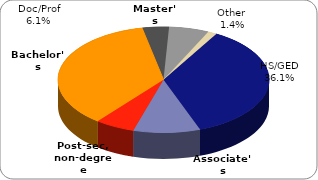
| Category | Series 0 |
|---|---|
| High school/
GED | 0.361 |
| Associate's | 0.102 |
| Post-sec,
non-degree | 0.061 |
| Bachelor's | 0.361 |
| Master's | 0.041 |
| Doctoral / Professional | 0.061 |
| Other (< High school; Some college, no degree) | 0.014 |